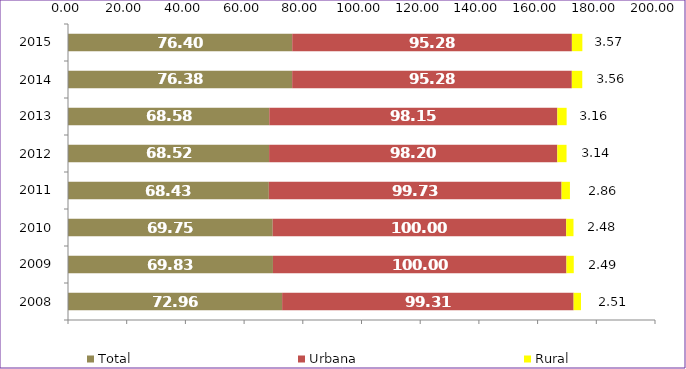
| Category | Total | Urbana | Rural |
|---|---|---|---|
| 2008.0 | 72.96 | 99.31 | 2.51 |
| 2009.0 | 69.83 | 100 | 2.49 |
| 2010.0 | 69.75 | 100 | 2.48 |
| 2011.0 | 68.43 | 99.73 | 2.86 |
| 2012.0 | 68.52 | 98.2 | 3.14 |
| 2013.0 | 68.58 | 98.15 | 3.16 |
| 2014.0 | 76.38 | 95.28 | 3.56 |
| 2015.0 | 76.4 | 95.28 | 3.57 |